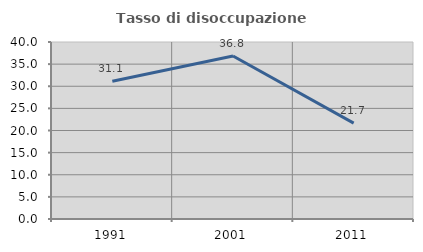
| Category | Tasso di disoccupazione giovanile  |
|---|---|
| 1991.0 | 31.111 |
| 2001.0 | 36.842 |
| 2011.0 | 21.667 |